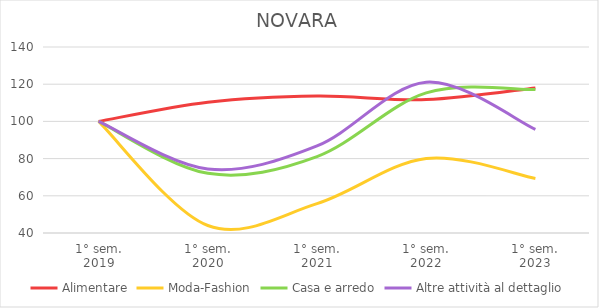
| Category | Alimentare | Moda-Fashion | Casa e arredo | Altre attività al dettaglio |
|---|---|---|---|---|
| 1° sem.
2019 | 100 | 100 | 100 | 100 |
| 1° sem.
2020 | 110.315 | 44.024 | 72.072 | 74.468 |
| 1° sem.
2021 | 113.636 | 55.777 | 81.081 | 86.809 |
| 1° sem.
2022 | 111.713 | 80.08 | 115.315 | 121.064 |
| 1° sem.
2023 | 118.007 | 69.323 | 117.117 | 95.745 |